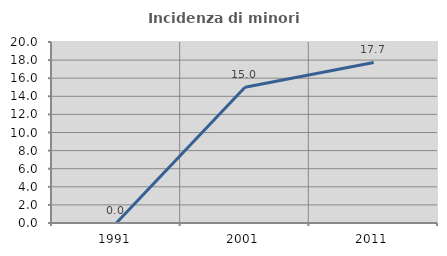
| Category | Incidenza di minori stranieri |
|---|---|
| 1991.0 | 0 |
| 2001.0 | 15 |
| 2011.0 | 17.742 |